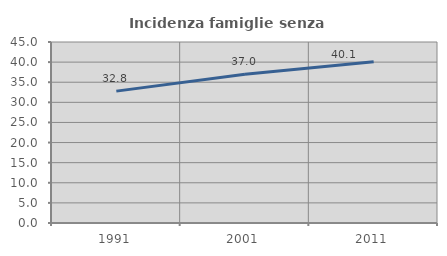
| Category | Incidenza famiglie senza nuclei |
|---|---|
| 1991.0 | 32.787 |
| 2001.0 | 36.957 |
| 2011.0 | 40.113 |